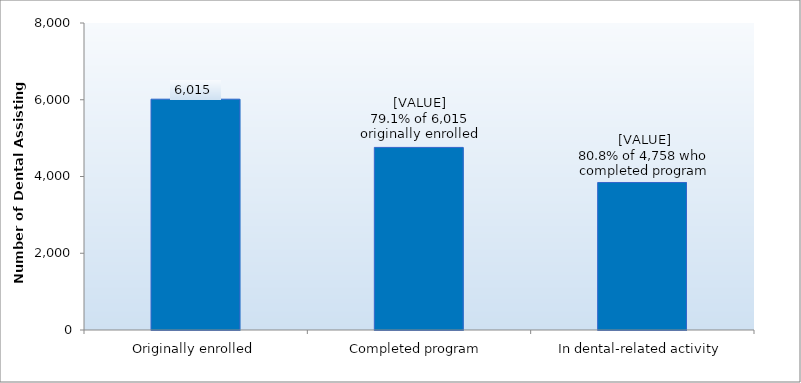
| Category | Series 0 |
|---|---|
| Originally enrolled | 6015 |
| Completed program | 4758 |
| In dental-related activity | 3844 |